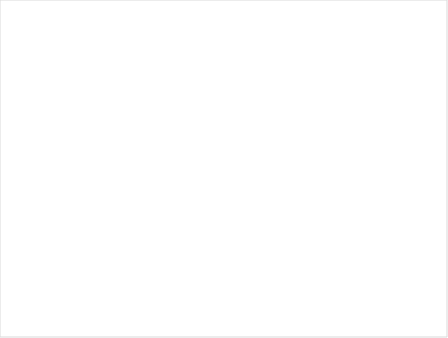
| Category | Total |
|---|---|
| 😁 | 69 |
| 🙂 | 35 |
| ☹️ | 7 |
| 😐 | 6 |